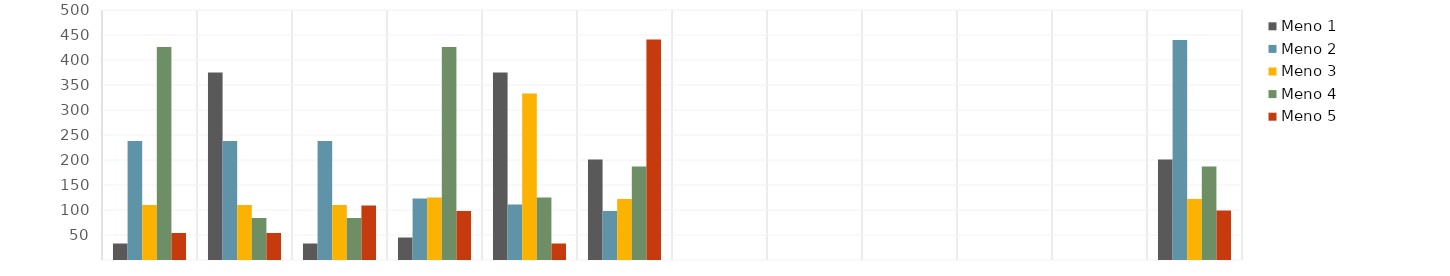
| Category | Meno 1 | Meno 2 | Meno 3 | Meno 4 | Meno 5 |
|---|---|---|---|---|---|
| Tammi | 33 | 238 | 110 | 426 | 54 |
| Helmi | 375 | 238 | 110 | 84 | 54 |
| Maalis | 33 | 238 | 110 | 84 | 109 |
| Huhti | 45 | 123 | 125 | 426 | 98 |
| Touko | 375 | 111 | 333 | 125 | 33 |
| Kesä | 201 | 98 | 122 | 187 | 441 |
| Heinä | 0 | 0 | 0 | 0 | 0 |
| Elo | 0 | 0 | 0 | 0 | 0 |
| Syys | 0 | 0 | 0 | 0 | 0 |
| Loka | 0 | 0 | 0 | 0 | 0 |
| Marras | 0 | 0 | 0 | 0 | 0 |
| Joulu | 201 | 440 | 122 | 187 | 99 |